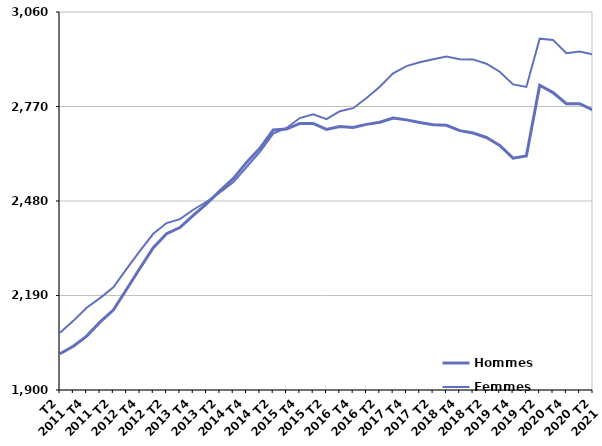
| Category | Hommes  | Femmes  |
|---|---|---|
| T2
2011 | 2011.3 | 2075.4 |
| T3
2011 | 2034.3 | 2112.2 |
| T4
2011 | 2065.3 | 2152.3 |
| T1
2012 | 2108.3 | 2182 |
| T2
2012 | 2145.4 | 2215.3 |
| T3
2012 | 2209.1 | 2271.7 |
| T4
2012 | 2273.8 | 2327.1 |
| T1
2013 | 2337 | 2379.3 |
| T2
2013 | 2379.7 | 2412.2 |
| T3
2013 | 2398.4 | 2424.5 |
| T4
2013 | 2435.6 | 2453.1 |
| T1
2014 | 2471.2 | 2477.6 |
| T2
2014 | 2511 | 2506 |
| T3
2014 | 2548.5 | 2537.2 |
| T4
2014 | 2598.4 | 2584.4 |
| T1
2015 | 2641.7 | 2630.5 |
| T2
2015 | 2697.8 | 2687 |
| T3
2015 | 2700.7 | 2704.1 |
| T4
2015 | 2718 | 2734.5 |
| T1
2016 | 2718.2 | 2745.8 |
| T2
2016 | 2699.5 | 2731.3 |
| T3
2016 | 2708.6 | 2755.7 |
| T4
2016 | 2705.6 | 2764.8 |
| T1
2017 | 2715.1 | 2796.2 |
| T2
2017 | 2721.7 | 2830.9 |
| T3
2017 | 2734.7 | 2871.9 |
| T4
2017 | 2729 | 2893.8 |
| T1
2018 | 2720.8 | 2905.8 |
| T2
2018 | 2714.2 | 2915.2 |
| T3
2018 | 2712.5 | 2923.6 |
| T4
2018 | 2695.9 | 2914.8 |
| T1
2019 | 2688.5 | 2914.6 |
| T2
2019 | 2674.9 | 2901.4 |
| T3
2019 | 2650.7 | 2876.7 |
| T4
2019 | 2611.5 | 2837.7 |
| T1
2020 | 2618.1 | 2830.1 |
| T2
2020 | 2835.1 | 2978.2 |
| T3
2020 | 2812.7 | 2974.4 |
| T4
2020 | 2778.4 | 2933.8 |
| T1
2021 | 2778.4 | 2938.5 |
| T2
2021 | 2759.2 | 2929.5 |